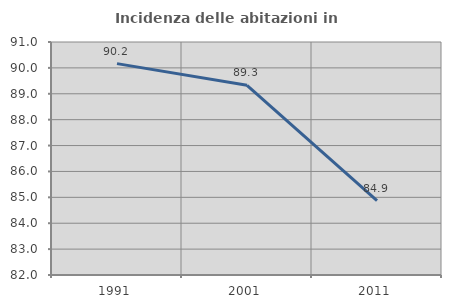
| Category | Incidenza delle abitazioni in proprietà  |
|---|---|
| 1991.0 | 90.164 |
| 2001.0 | 89.328 |
| 2011.0 | 84.871 |